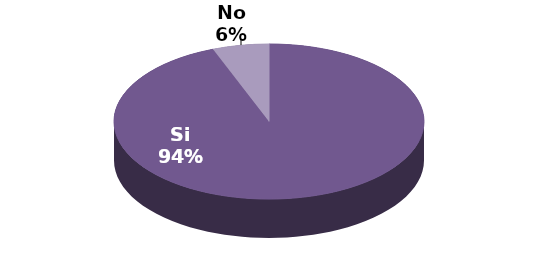
| Category | Series 1 |
|---|---|
| Si | 16 |
| No | 1 |